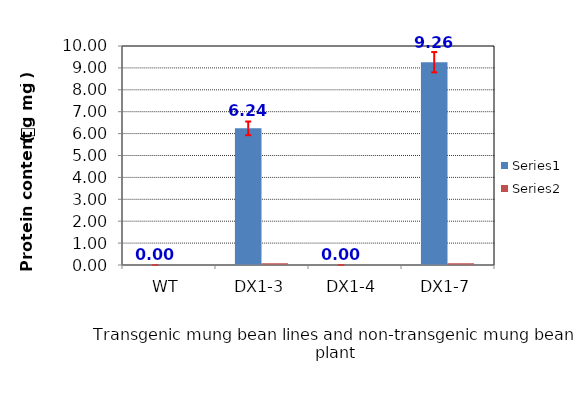
| Category | Series 0 | Series 1 |
|---|---|---|
| WT | 0 | 0 |
| DX1-3 | 6.24 | 0.08 |
| DX1-4 | 0 | 0 |
| DX1-7 | 9.26 | 0.08 |